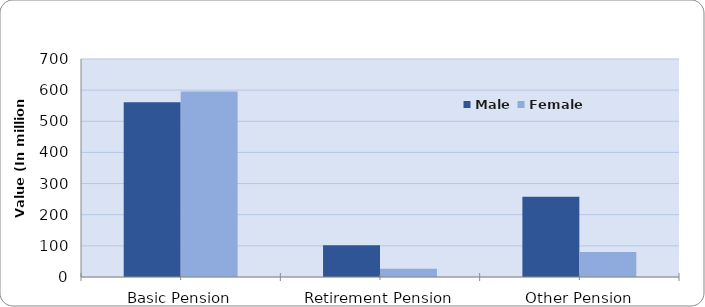
| Category | Male | Female |
|---|---|---|
| Basic Pension | 561.096 | 596.04 |
| Retirement Pension | 102.021 | 26.519 |
| Other Pension | 257.688 | 80.166 |